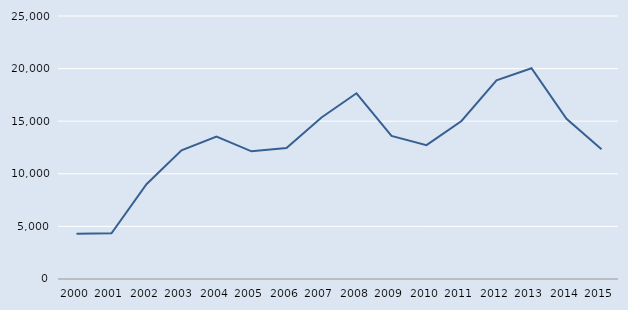
| Category | Series 0 |
|---|---|
| 2000.0 | 4311 |
| 2001.0 | 4347 |
| 2002.0 | 9005 |
| 2003.0 | 12228 |
| 2004.0 | 13539 |
| 2005.0 | 12138 |
| 2006.0 | 12441 |
| 2007.0 | 15351 |
| 2008.0 | 17657 |
| 2009.0 | 13601 |
| 2010.0 | 12720 |
| 2011.0 | 15020 |
| 2012.0 | 18892 |
| 2013.0 | 20039 |
| 2014.0 | 15221 |
| 2015.0 | 12325 |